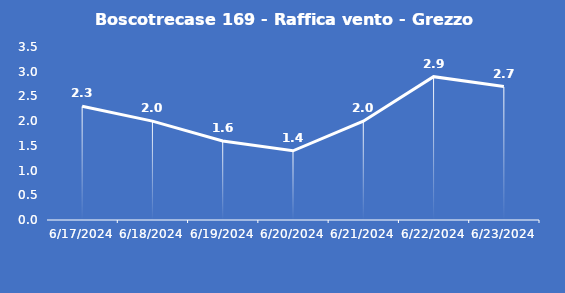
| Category | Boscotrecase 169 - Raffica vento - Grezzo (m/s) |
|---|---|
| 6/17/24 | 2.3 |
| 6/18/24 | 2 |
| 6/19/24 | 1.6 |
| 6/20/24 | 1.4 |
| 6/21/24 | 2 |
| 6/22/24 | 2.9 |
| 6/23/24 | 2.7 |